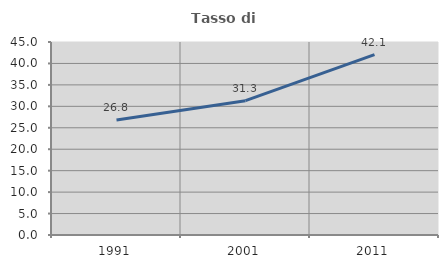
| Category | Tasso di occupazione   |
|---|---|
| 1991.0 | 26.792 |
| 2001.0 | 31.315 |
| 2011.0 | 42.072 |